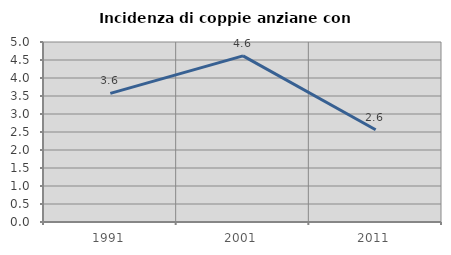
| Category | Incidenza di coppie anziane con figli |
|---|---|
| 1991.0 | 3.571 |
| 2001.0 | 4.615 |
| 2011.0 | 2.564 |